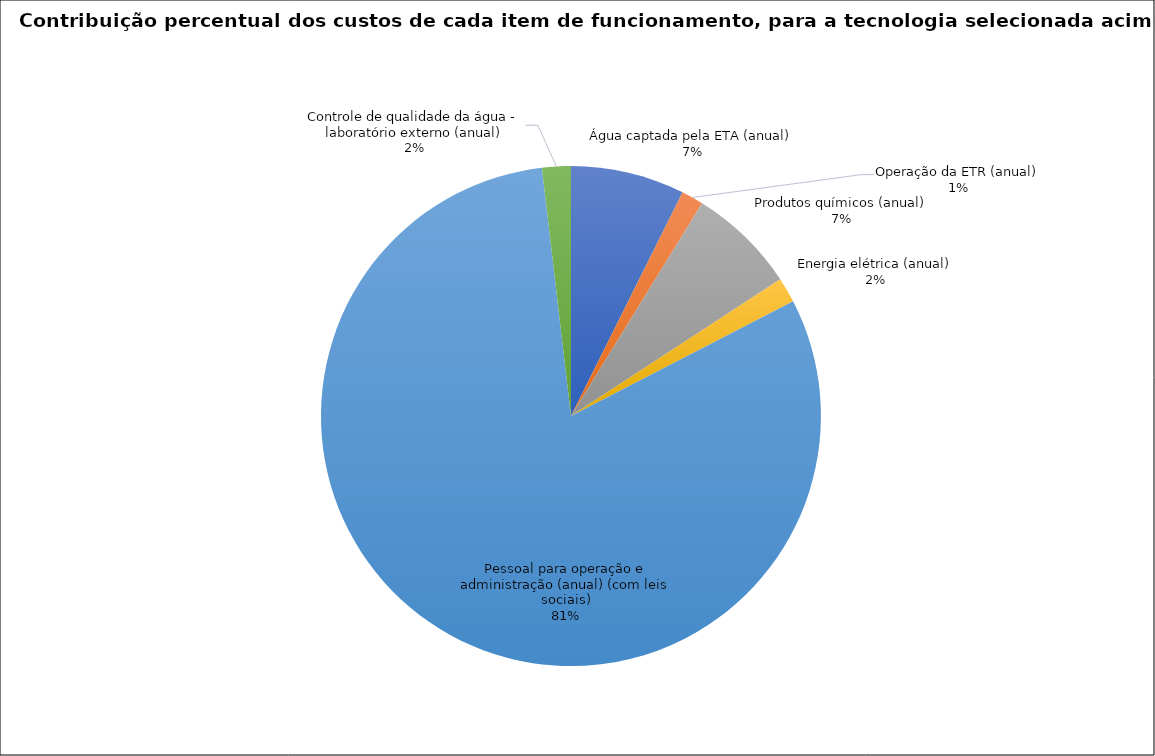
| Category | FDD - ETR3 e |
|---|---|
| Água captada pela ETA (anual) | 43545.6 |
| Operação da ETR (anual) | 8409.24 |
| Produtos químicos (anual) | 41371.2 |
| Energia elétrica (anual) | 9652.306 |
| Pessoal para operação e administração (anual) (com leis sociais) | 477355.101 |
| Controle de qualidade da água - laboratório externo (anual) | 10994.29 |